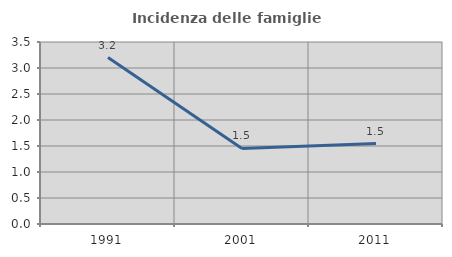
| Category | Incidenza delle famiglie numerose |
|---|---|
| 1991.0 | 3.2 |
| 2001.0 | 1.453 |
| 2011.0 | 1.546 |